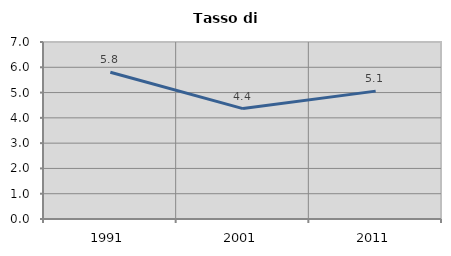
| Category | Tasso di disoccupazione   |
|---|---|
| 1991.0 | 5.802 |
| 2001.0 | 4.366 |
| 2011.0 | 5.058 |